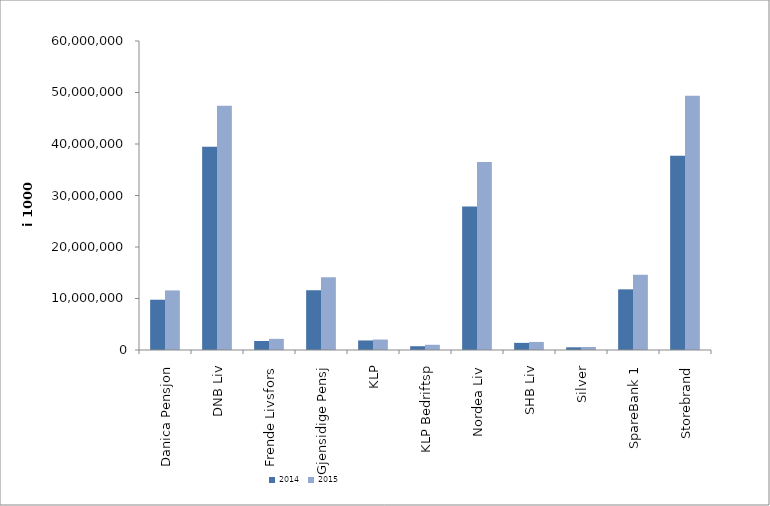
| Category | 2014 | 2015 |
|---|---|---|
| Danica Pensjon | 9764258.039 | 11569001.886 |
| DNB Liv | 39457941 | 47449700 |
| Frende Livsfors | 1751735 | 2163790 |
| Gjensidige Pensj | 11604506.424 | 14148914.607 |
| KLP | 1852989.432 | 2029624.791 |
| KLP Bedriftsp | 734508 | 1015795 |
| Nordea Liv | 27871306.558 | 36516794.106 |
| SHB Liv | 1387383 | 1562174 |
| Silver | 520188.141 | 584555.291 |
| SpareBank 1 | 11778985.424 | 14634426.34 |
| Storebrand | 37731562.259 | 49369943.155 |